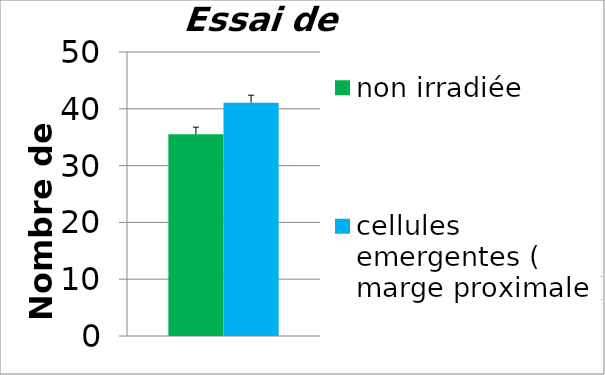
| Category | non irradiée | cellules emergentes ( marge proximale ) |
|---|---|---|
| 0 | 35.5 | 41.067 |